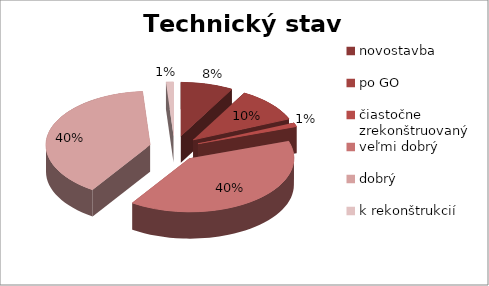
| Category | Technický stav kancelárií |
|---|---|
| novostavba | 7 |
| po GO | 9 |
| čiastočne zrekonštruovaný | 1 |
| veľmi dobrý | 34 |
| dobrý | 34 |
| k rekonštrukcií | 1 |